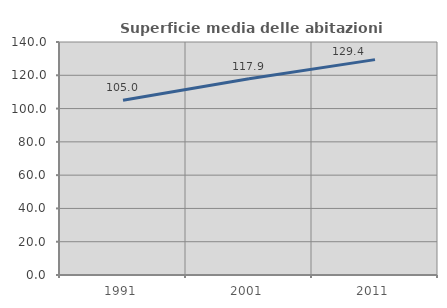
| Category | Superficie media delle abitazioni occupate |
|---|---|
| 1991.0 | 105.032 |
| 2001.0 | 117.908 |
| 2011.0 | 129.418 |